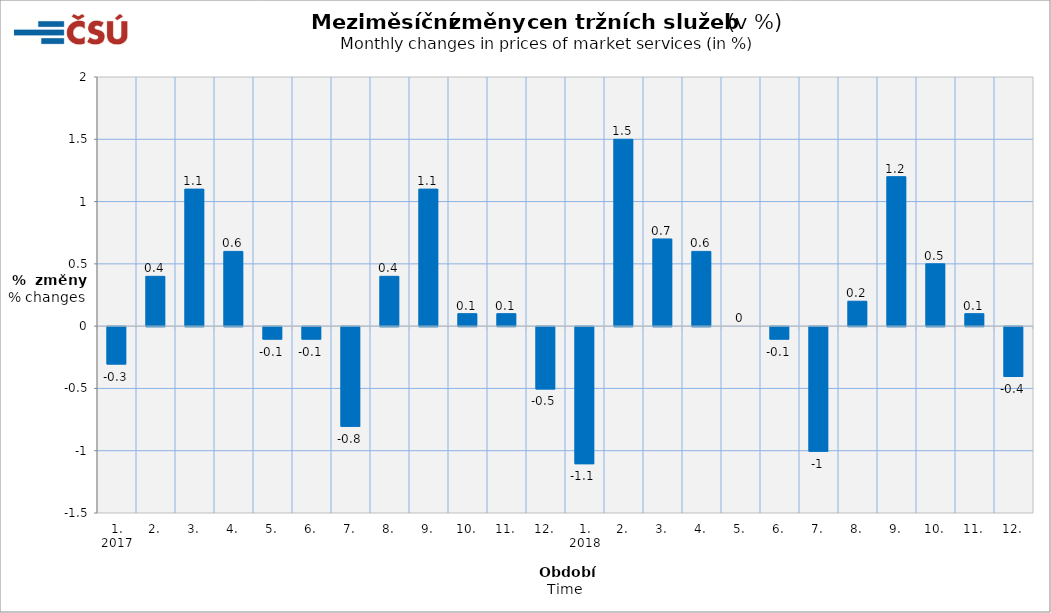
| Category | Meziměsíční změny v % |
|---|---|
| 0 | -0.3 |
| 1 | 0.4 |
| 2 | 1.1 |
| 3 | 0.6 |
| 4 | -0.1 |
| 5 | -0.1 |
| 6 | -0.8 |
| 7 | 0.4 |
| 8 | 1.1 |
| 9 | 0.1 |
| 10 | 0.1 |
| 11 | -0.5 |
| 12 | -1.1 |
| 13 | 1.5 |
| 14 | 0.7 |
| 15 | 0.6 |
| 16 | 0 |
| 17 | -0.1 |
| 18 | -1 |
| 19 | 0.2 |
| 20 | 1.2 |
| 21 | 0.5 |
| 22 | 0.1 |
| 23 | -0.4 |